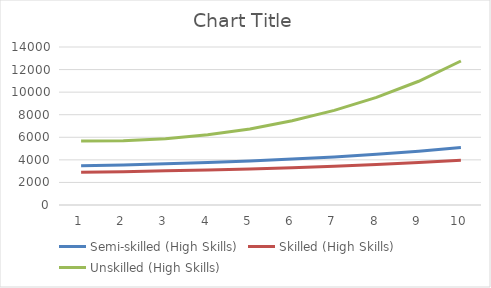
| Category | Semi-skilled (High Skills) | Skilled (High Skills) | Unskilled (High Skills) |
|---|---|---|---|
| 0 | 3485.45 | 2906.004 | 5674.118 |
| 1 | 3548.565 | 2949.812 | 5703.997 |
| 2 | 3656.307 | 3024.298 | 5876.6 |
| 3 | 3768.257 | 3101.283 | 6219.659 |
| 4 | 3902.004 | 3192.269 | 6742.573 |
| 5 | 4065.638 | 3302.291 | 7472.461 |
| 6 | 4262.459 | 3433.105 | 8386.557 |
| 7 | 4496.544 | 3586.843 | 9531.601 |
| 8 | 4772.888 | 3766.076 | 10963.644 |
| 9 | 5097.581 | 3973.884 | 12760.215 |